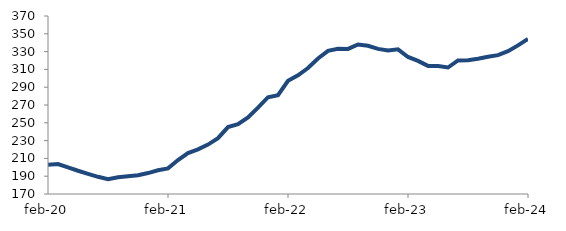
| Category | Series 0 |
|---|---|
| 2020-02-01 | 202.996 |
| 2020-03-01 | 203.606 |
| 2020-04-01 | 199.997 |
| 2020-05-01 | 196.129 |
| 2020-06-01 | 192.644 |
| 2020-07-01 | 189.309 |
| 2020-08-01 | 186.635 |
| 2020-09-01 | 188.903 |
| 2020-10-01 | 189.967 |
| 2020-11-01 | 191.14 |
| 2020-12-01 | 193.522 |
| 2021-01-01 | 196.705 |
| 2021-02-01 | 198.76 |
| 2021-03-01 | 208.155 |
| 2021-04-01 | 215.916 |
| 2021-05-01 | 220.213 |
| 2021-06-01 | 225.532 |
| 2021-07-01 | 232.751 |
| 2021-08-01 | 245.217 |
| 2021-09-01 | 248.367 |
| 2021-10-01 | 256.011 |
| 2021-11-01 | 267.005 |
| 2021-12-01 | 278.738 |
| 2022-01-01 | 281.024 |
| 2022-02-01 | 297.23 |
| 2022-03-01 | 303.362 |
| 2022-04-01 | 311.514 |
| 2022-05-01 | 322.269 |
| 2022-06-01 | 330.847 |
| 2022-07-01 | 333.173 |
| 2022-08-01 | 333.056 |
| 2022-09-01 | 338.053 |
| 2022-10-01 | 336.541 |
| 2022-11-01 | 333.017 |
| 2022-12-01 | 331.349 |
| 2023-01-01 | 332.533 |
| 2023-02-01 | 323.969 |
| 2023-03-01 | 319.613 |
| 2023-04-01 | 313.925 |
| 2023-05-01 | 313.735 |
| 2023-06-01 | 312.115 |
| 2023-07-01 | 320.047 |
| 2023-08-01 | 320.242 |
| 2023-09-01 | 322.058 |
| 2023-10-01 | 324.205 |
| 2023-11-01 | 326.053 |
| 2023-12-01 | 330.533 |
| 2024-01-01 | 336.954 |
| 2024-02-01 | 344.27 |